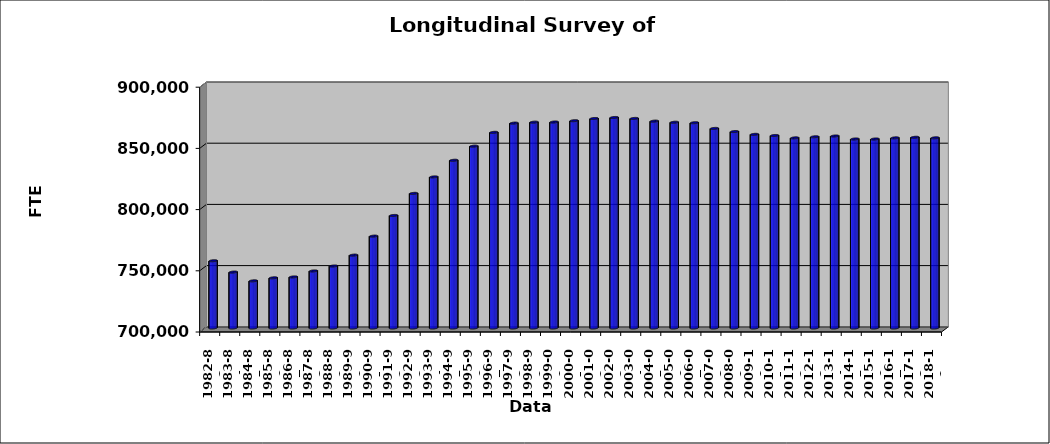
| Category | Series 0 |
|---|---|
| 1982-83 | 754938 |
| 1983-84 | 745702 |
| 1984-85 | 738525 |
| 1985-86 | 740976 |
| 1986-87 | 741733 |
| 1987-88 | 746615 |
| 1988-89 | 750642 |
| 1989-90 | 759531 |
| 1990-91 | 775056 |
| 1991-92 | 791938 |
| 1992-93 | 809982 |
| 1993-94 | 823435 |
| 1994-95 | 837028 |
| 1995-96 | 848559 |
| 1996-97 | 859830 |
| 1997-98 | 867380 |
| 1998-99 | 868161 |
| 1999-00 | 868279 |
| 2000-01 | 869357 |
| 2001-02 | 871154 |
| 2002-03 | 871981 |
| 2003-04 | 871202 |
| 2004-05 | 869005 |
| 2005-06 | 868092 |
| 2006-07 | 867698 |
| 2007-08 | 863047 |
| 2008-09 | 860477 |
| 2009-10 | 858205 |
| 2010-11 | 857273 |
| 2011-12 | 855327 |
| 2012-13 | 856203 |
| 2013-14 | 856846 |
| 2014-15 | 854419 |
| 2015-16 | 854403 |
| 2016-17 | 855329 |
| 2017-18 | 855804 |
| 2018-19 | 855360 |